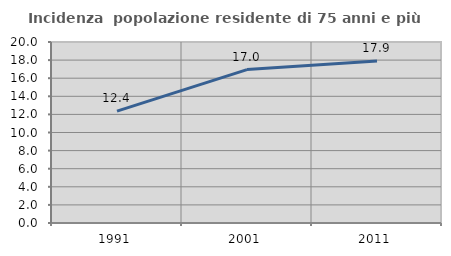
| Category | Incidenza  popolazione residente di 75 anni e più |
|---|---|
| 1991.0 | 12.36 |
| 2001.0 | 16.951 |
| 2011.0 | 17.891 |